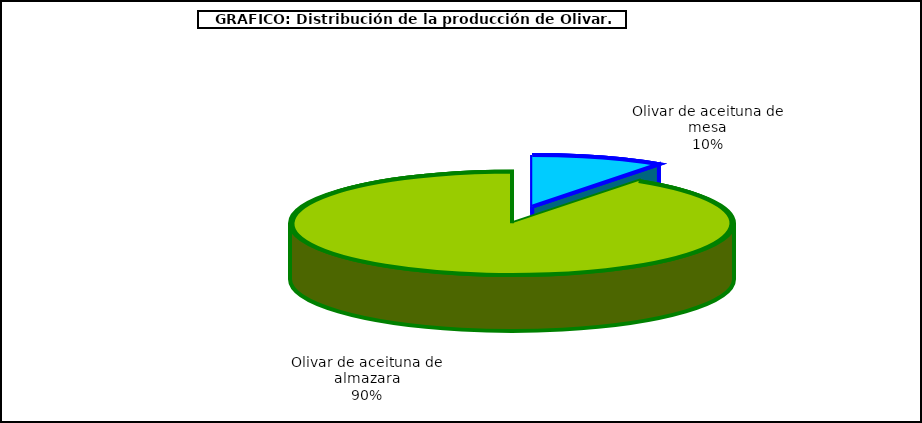
| Category | Series 0 |
|---|---|
| Olivar de aceituna de mesa | 442478 |
| Olivar de aceituna de almazara | 4136730 |